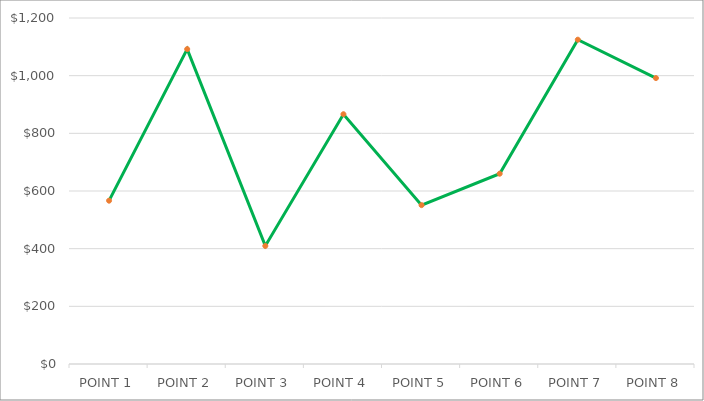
| Category | Series 1 |
|---|---|
| POINT 1 | 566.475 |
| POINT 2 | 1092.065 |
| POINT 3 | 409.5 |
| POINT 4 | 866.25 |
| POINT 5 | 551 |
| POINT 6 | 660 |
| POINT 7 | 1124.75 |
| POINT 8 | 991.76 |